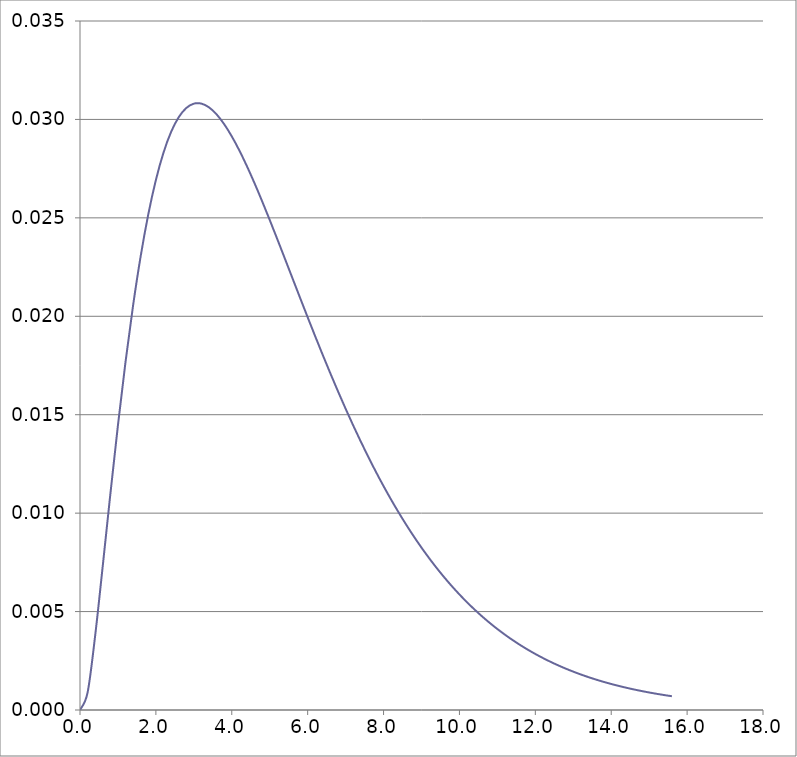
| Category | Series 0 |
|---|---|
| 0.0 | 0 |
| 0.2 | 0.001 |
| 0.4 | 0.004 |
| 0.6 | 0.007 |
| 0.8 | 0.011 |
| 1.0 | 0.014 |
| 1.2 | 0.018 |
| 1.4 | 0.021 |
| 1.6 | 0.023 |
| 1.8 | 0.025 |
| 2.0 | 0.027 |
| 2.2 | 0.028 |
| 2.4 | 0.029 |
| 2.6 | 0.03 |
| 2.8 | 0.031 |
| 3.0 | 0.031 |
| 3.200000000000001 | 0.031 |
| 3.400000000000001 | 0.031 |
| 3.600000000000001 | 0.03 |
| 3.800000000000001 | 0.03 |
| 4.000000000000001 | 0.029 |
| 4.200000000000001 | 0.028 |
| 4.400000000000001 | 0.028 |
| 4.600000000000001 | 0.027 |
| 4.800000000000002 | 0.026 |
| 5.000000000000002 | 0.025 |
| 5.200000000000002 | 0.024 |
| 5.400000000000002 | 0.023 |
| 5.600000000000002 | 0.022 |
| 5.800000000000002 | 0.021 |
| 6.000000000000003 | 0.02 |
| 6.200000000000003 | 0.019 |
| 6.400000000000003 | 0.018 |
| 6.600000000000003 | 0.017 |
| 6.800000000000003 | 0.016 |
| 7.000000000000004 | 0.015 |
| 7.200000000000004 | 0.014 |
| 7.400000000000004 | 0.014 |
| 7.600000000000004 | 0.013 |
| 7.800000000000004 | 0.012 |
| 8.000000000000004 | 0.011 |
| 8.200000000000003 | 0.011 |
| 8.400000000000002 | 0.01 |
| 8.600000000000001 | 0.009 |
| 8.8 | 0.009 |
| 9.0 | 0.008 |
| 9.2 | 0.008 |
| 9.399999999999999 | 0.007 |
| 9.599999999999998 | 0.007 |
| 9.799999999999997 | 0.006 |
| 9.999999999999996 | 0.006 |
| 10.2 | 0.005 |
| 10.39999999999999 | 0.005 |
| 10.59999999999999 | 0.005 |
| 10.79999999999999 | 0.004 |
| 11.0 | 0.004 |
| 11.2 | 0.004 |
| 11.4 | 0.004 |
| 11.6 | 0.003 |
| 11.79999999999999 | 0.003 |
| 11.99999999999999 | 0.003 |
| 12.19999999999999 | 0.003 |
| 12.39999999999999 | 0.002 |
| 12.59999999999999 | 0.002 |
| 12.79999999999999 | 0.002 |
| 12.99999999999999 | 0.002 |
| 13.19999999999999 | 0.002 |
| 13.39999999999998 | 0.002 |
| 13.59999999999998 | 0.002 |
| 13.79999999999998 | 0.001 |
| 13.99999999999998 | 0.001 |
| 14.19999999999998 | 0.001 |
| 14.39999999999998 | 0.001 |
| 14.59999999999998 | 0.001 |
| 14.79999999999998 | 0.001 |
| 14.99999999999998 | 0.001 |
| 15.19999999999998 | 0.001 |
| 15.39999999999998 | 0.001 |
| 15.59999999999998 | 0.001 |